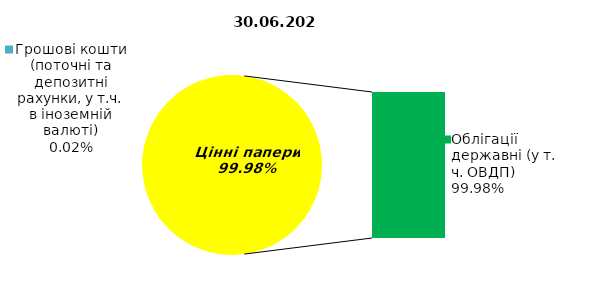
| Category | Series 0 |
|---|---|
| Грошові кошти (поточні та депозитні рахунки, у т.ч. в іноземній валюті) | 0.03 |
| Банківські метали | 0 |
| Нерухомість | 0 |
| Інші активи | 0 |
| Акції | 0 |
| Облігації підприємств | 0 |
| Муніципальні облігації | 0 |
| Облігації державні (у т. ч. ОВДП) | 157.177 |
| Іпотечні сертифікати | 0 |